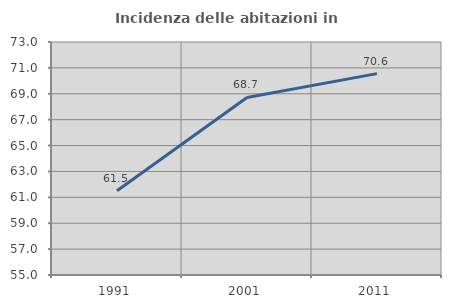
| Category | Incidenza delle abitazioni in proprietà  |
|---|---|
| 1991.0 | 61.508 |
| 2001.0 | 68.718 |
| 2011.0 | 70.555 |